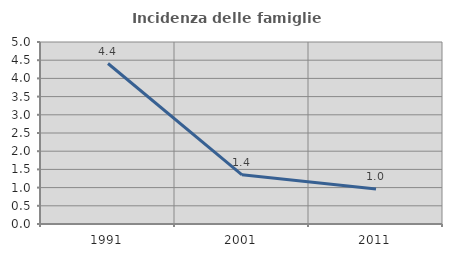
| Category | Incidenza delle famiglie numerose |
|---|---|
| 1991.0 | 4.409 |
| 2001.0 | 1.351 |
| 2011.0 | 0.962 |